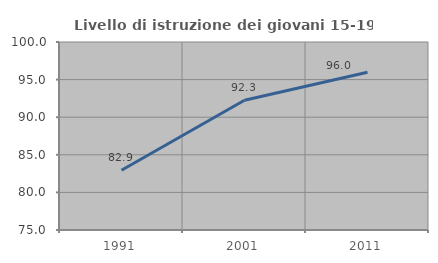
| Category | Livello di istruzione dei giovani 15-19 anni |
|---|---|
| 1991.0 | 82.948 |
| 2001.0 | 92.252 |
| 2011.0 | 95.973 |